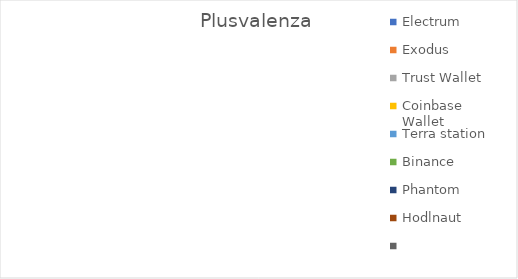
| Category | Plusvalenza |
|---|---|
| Electrum | 0 |
| Exodus | 0 |
| Trust Wallet | 0 |
| Coinbase Wallet | 0 |
| Terra station | 0 |
| Binance | 0 |
| Phantom | 0 |
| Hodlnaut | 0 |